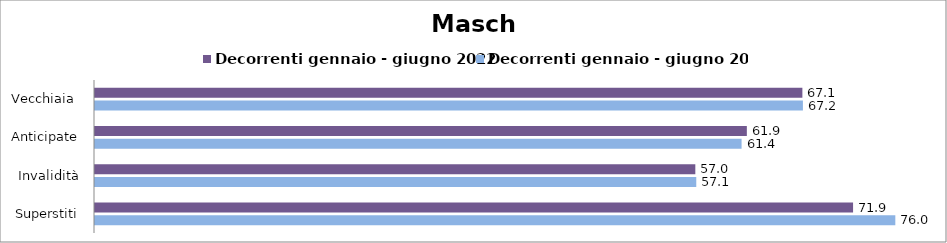
| Category | Decorrenti gennaio - giugno 2022 | Decorrenti gennaio - giugno 2023 |
|---|---|---|
| Vecchiaia  | 67.13 | 67.18 |
| Anticipate | 61.86 | 61.36 |
| Invalidità | 56.97 | 57.06 |
| Superstiti | 71.94 | 75.95 |